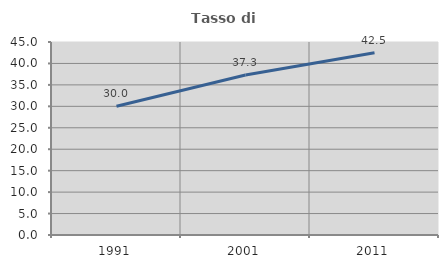
| Category | Tasso di occupazione   |
|---|---|
| 1991.0 | 30.038 |
| 2001.0 | 37.311 |
| 2011.0 | 42.493 |